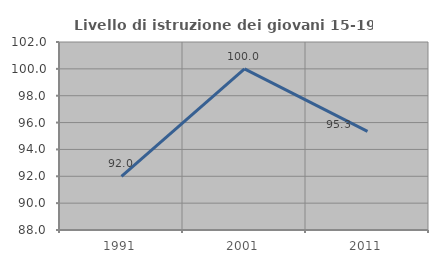
| Category | Livello di istruzione dei giovani 15-19 anni |
|---|---|
| 1991.0 | 92 |
| 2001.0 | 100 |
| 2011.0 | 95.349 |